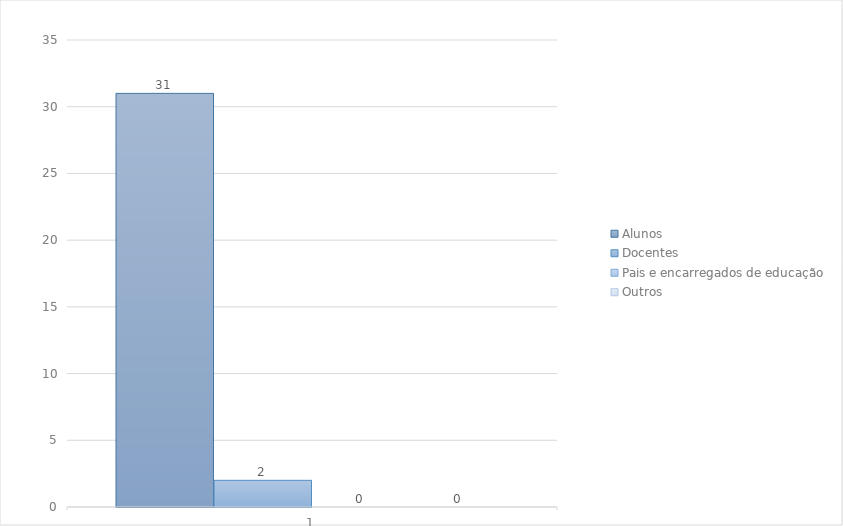
| Category | Alunos | Docentes | Pais e encarregados de educação | Outros |
|---|---|---|---|---|
| 0 | 31 | 2 | 0 | 0 |